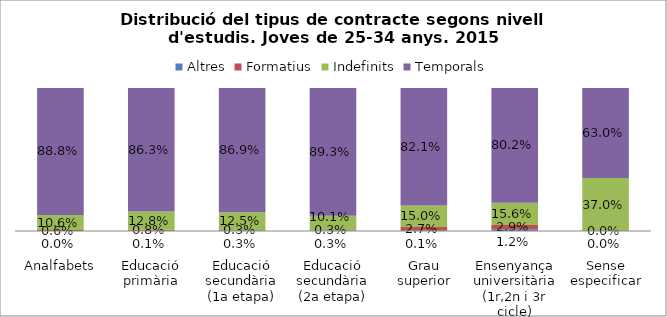
| Category | Altres | Formatius | Indefinits | Temporals |
|---|---|---|---|---|
|  
Analfabets | 0 | 0.006 | 0.106 | 0.888 |
| 
Educació primària | 0.001 | 0.008 | 0.128 | 0.863 |
| 
Educació secundària (1a etapa) | 0.003 | 0.003 | 0.125 | 0.869 |
| 
Educació secundària (2a etapa) | 0.003 | 0.003 | 0.101 | 0.893 |
| 
Grau superior | 0.001 | 0.027 | 0.15 | 0.821 |
| 
Ensenyança universitària (1r,2n i 3r cicle) | 0.012 | 0.029 | 0.156 | 0.802 |
| 
Sense especificar | 0 | 0 | 0.37 | 0.63 |